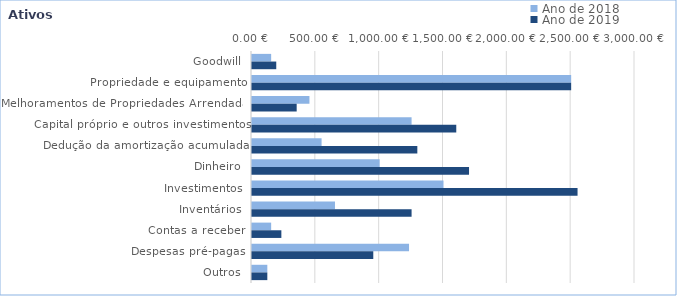
| Category | Ano de 2018 | Ano de 2019 |
|---|---|---|
| Goodwill | 150 | 190 |
| Propriedade e equipamento | 2500 | 2500 |
| Melhoramentos de Propriedades Arrendadas | 450 | 350 |
| Capital próprio e outros investimentos | 1250 | 1600 |
| Dedução da amortização acumulada | 545 | 1295 |
| Dinheiro | 1000 | 1700 |
| Investimentos | 1500 | 2550 |
| Inventários | 650 | 1250 |
| Contas a receber | 150 | 230 |
| Despesas pré-pagas | 1230 | 950 |
| Outros | 120 | 120 |